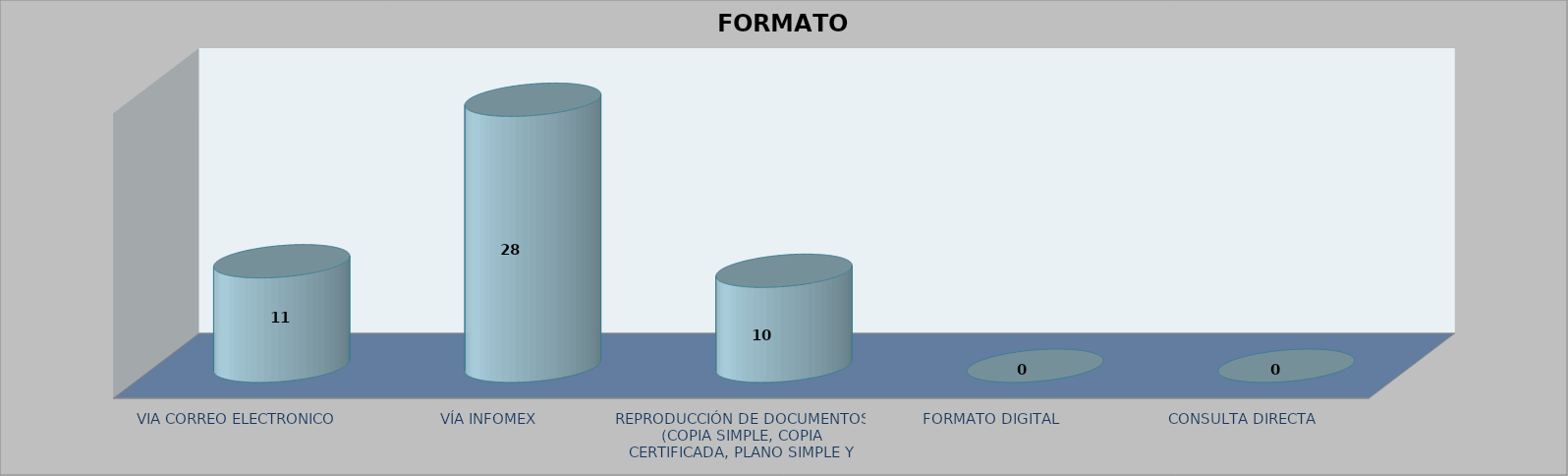
| Category |        FORMATO SOLICITADO | Series 1 | Series 2 |
|---|---|---|---|
| VIA CORREO ELECTRONICO |  |  | 11 |
| VÍA INFOMEX |  |  | 28 |
| REPRODUCCIÓN DE DOCUMENTOS (COPIA SIMPLE, COPIA CERTIFICADA, PLANO SIMPLE Y PLANO CERTIFICADO) |  |  | 10 |
| FORMATO DIGITAL |  |  | 0 |
| CONSULTA DIRECTA |  |  | 0 |